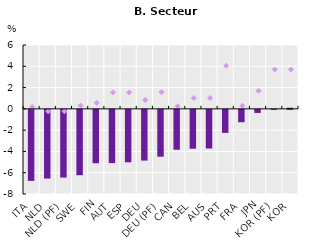
| Category | 2022 (↗) |
|---|---|
| ITA | -6.672 |
| NLD | -6.456 |
| NLD (PF) | -6.365 |
| SWE | -6.141 |
| FIN | -5.016 |
| AUT | -5.005 |
| ESP | -4.927 |
| DEU | -4.766 |
| DEU (PF) | -4.4 |
| CAN | -3.748 |
| BEL | -3.655 |
| AUS | -3.632 |
| PRT | -2.163 |
| FRA | -1.162 |
| JPN | -0.29 |
| KOR (PF) | 0.012 |
| KOR | 0.107 |